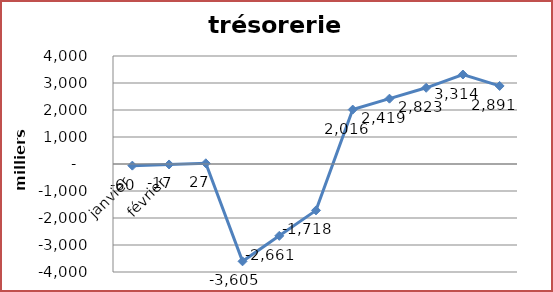
| Category | Series 0 |
|---|---|
| janvier | -60.47 |
| février | -16.97 |